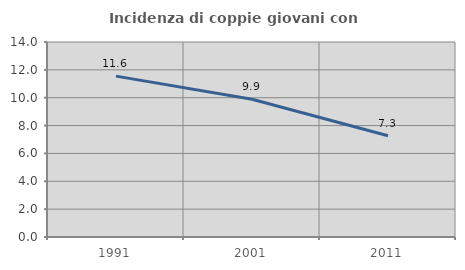
| Category | Incidenza di coppie giovani con figli |
|---|---|
| 1991.0 | 11.551 |
| 2001.0 | 9.885 |
| 2011.0 | 7.27 |